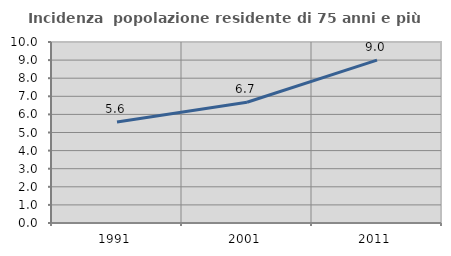
| Category | Incidenza  popolazione residente di 75 anni e più |
|---|---|
| 1991.0 | 5.585 |
| 2001.0 | 6.67 |
| 2011.0 | 9.001 |